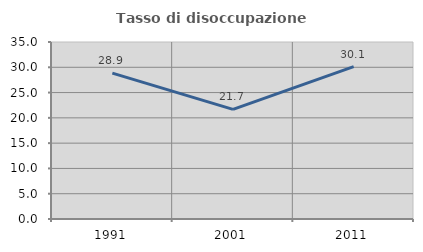
| Category | Tasso di disoccupazione giovanile  |
|---|---|
| 1991.0 | 28.856 |
| 2001.0 | 21.687 |
| 2011.0 | 30.12 |